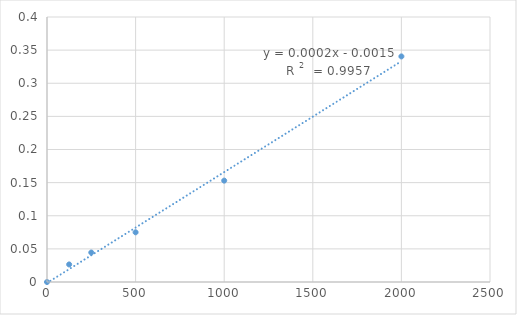
| Category | Series 0 |
|---|---|
| 0.0 | 0 |
| 125.0 | 0.026 |
| 250.0 | 0.044 |
| 500.0 | 0.075 |
| 1000.0 | 0.153 |
| 2000.0 | 0.34 |